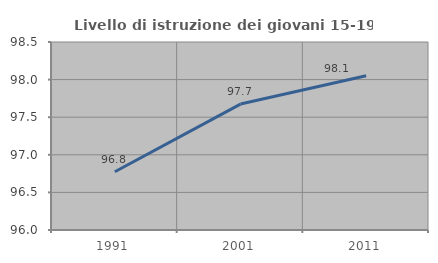
| Category | Livello di istruzione dei giovani 15-19 anni |
|---|---|
| 1991.0 | 96.774 |
| 2001.0 | 97.674 |
| 2011.0 | 98.052 |